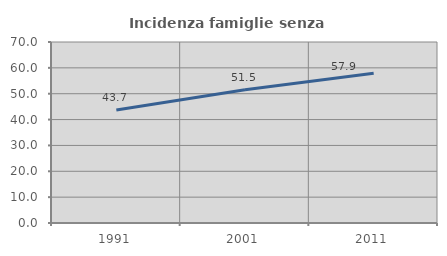
| Category | Incidenza famiglie senza nuclei |
|---|---|
| 1991.0 | 43.715 |
| 2001.0 | 51.502 |
| 2011.0 | 57.919 |